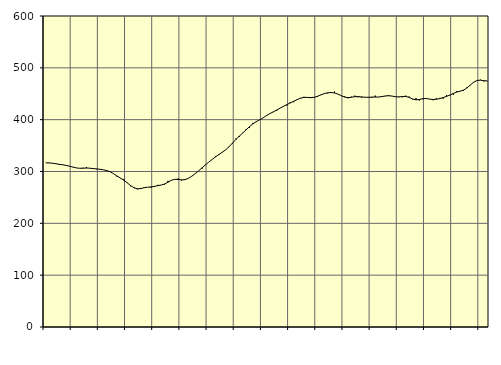
| Category | Piggar | Series 1 |
|---|---|---|
| nan | 316.8 | 316.72 |
| 87.0 | 316.8 | 316.53 |
| 87.0 | 316.2 | 315.98 |
| 87.0 | 314.6 | 314.95 |
| nan | 312.8 | 313.84 |
| 88.0 | 313.3 | 312.93 |
| 88.0 | 311.3 | 311.8 |
| 88.0 | 309.8 | 310.27 |
| nan | 308.3 | 308.58 |
| 89.0 | 307 | 306.98 |
| 89.0 | 306.1 | 306.17 |
| 89.0 | 307.3 | 306.36 |
| nan | 308.8 | 306.72 |
| 90.0 | 306.2 | 306.39 |
| 90.0 | 306.2 | 305.62 |
| 90.0 | 304.2 | 305.03 |
| nan | 303.8 | 304.3 |
| 91.0 | 303.2 | 303.17 |
| 91.0 | 300.7 | 301.68 |
| 91.0 | 299 | 299.39 |
| nan | 295.6 | 295.65 |
| 92.0 | 289.9 | 291.29 |
| 92.0 | 286.9 | 287.36 |
| 92.0 | 285.6 | 283.18 |
| nan | 277.7 | 278.16 |
| 93.0 | 271.5 | 272.77 |
| 93.0 | 270 | 268.54 |
| 93.0 | 265.5 | 266.58 |
| nan | 268.1 | 267.08 |
| 94.0 | 269.5 | 268.77 |
| 94.0 | 269.6 | 269.73 |
| 94.0 | 268.9 | 270.16 |
| nan | 270 | 271.27 |
| 95.0 | 274.3 | 272.68 |
| 95.0 | 273.8 | 273.87 |
| 95.0 | 274.6 | 275.93 |
| nan | 282 | 279.39 |
| 96.0 | 282.6 | 283.01 |
| 96.0 | 284.8 | 284.93 |
| 96.0 | 286.6 | 284.69 |
| nan | 282.5 | 283.81 |
| 97.0 | 283.7 | 284.23 |
| 97.0 | 286.5 | 286.82 |
| 97.0 | 291.2 | 290.93 |
| nan | 295.5 | 295.74 |
| 98.0 | 301.3 | 301.21 |
| 98.0 | 305.2 | 307.01 |
| 98.0 | 313 | 312.55 |
| nan | 318.2 | 318.17 |
| 99.0 | 323.2 | 323.27 |
| 99.0 | 329.6 | 328.18 |
| 99.0 | 332.1 | 332.84 |
| nan | 337.7 | 337.21 |
| 0.0 | 341.6 | 341.88 |
| 0.0 | 347.3 | 347.82 |
| 0.0 | 354.3 | 354.96 |
| nan | 363.7 | 361.92 |
| 1.0 | 366.6 | 368.26 |
| 1.0 | 374.7 | 374.25 |
| 1.0 | 381.8 | 380.38 |
| nan | 384.4 | 386.51 |
| 2.0 | 393.8 | 391.87 |
| 2.0 | 395.3 | 396.23 |
| 2.0 | 400.2 | 399.83 |
| nan | 403.6 | 403.53 |
| 3.0 | 408.6 | 407.81 |
| 3.0 | 412 | 411.72 |
| 3.0 | 414.5 | 415.12 |
| nan | 417.4 | 418.61 |
| 4.0 | 422.1 | 422.15 |
| 4.0 | 426.1 | 425.73 |
| 4.0 | 427.5 | 429 |
| nan | 433.8 | 432.35 |
| 5.0 | 433.7 | 435.51 |
| 5.0 | 439.1 | 438.56 |
| 5.0 | 441.9 | 441.36 |
| nan | 444.2 | 442.88 |
| 6.0 | 442.5 | 442.99 |
| 6.0 | 441.5 | 442.63 |
| 6.0 | 443.4 | 443.09 |
| nan | 443.7 | 445.03 |
| 7.0 | 448.2 | 447.77 |
| 7.0 | 450.9 | 450.28 |
| 7.0 | 450.7 | 451.83 |
| nan | 452.6 | 452.34 |
| 8.0 | 454.3 | 451.61 |
| 8.0 | 449.3 | 449.44 |
| 8.0 | 446.1 | 446.32 |
| nan | 445 | 443.59 |
| 9.0 | 441.3 | 442.43 |
| 9.0 | 444.3 | 443.25 |
| 9.0 | 446.4 | 444.39 |
| nan | 443.2 | 444.52 |
| 10.0 | 442.3 | 443.89 |
| 10.0 | 443.4 | 443.25 |
| 10.0 | 442.5 | 443.18 |
| nan | 442.1 | 443.52 |
| 11.0 | 446.4 | 443.63 |
| 11.0 | 443.4 | 443.76 |
| 11.0 | 444.4 | 444.53 |
| nan | 445.1 | 445.8 |
| 12.0 | 445.3 | 446.33 |
| 12.0 | 445.3 | 445.43 |
| 12.0 | 444 | 444.23 |
| nan | 443.4 | 443.92 |
| 13.0 | 443.2 | 444.71 |
| 13.0 | 446.3 | 444.89 |
| 13.0 | 444.6 | 442.97 |
| nan | 439.1 | 439.94 |
| 14.0 | 441.6 | 438.26 |
| 14.0 | 437 | 439 |
| 14.0 | 439.3 | 440.53 |
| nan | 441.8 | 440.83 |
| 15.0 | 439.4 | 439.72 |
| 15.0 | 437.5 | 438.92 |
| 15.0 | 441.4 | 439.36 |
| nan | 442 | 440.69 |
| 16.0 | 440.4 | 442.67 |
| 16.0 | 447.5 | 444.87 |
| 16.0 | 446.7 | 447.5 |
| nan | 448 | 450.58 |
| 17.0 | 455.3 | 453.19 |
| 17.0 | 454.5 | 455 |
| 17.0 | 455.6 | 457 |
| nan | 462.1 | 461.12 |
| 18.0 | 466.4 | 466.89 |
| 18.0 | 472.8 | 472.21 |
| 18.0 | 474.8 | 475.63 |
| nan | 477.1 | 476.24 |
| 19.0 | 473.8 | 475.15 |
| 19.0 | 474.1 | 474.75 |